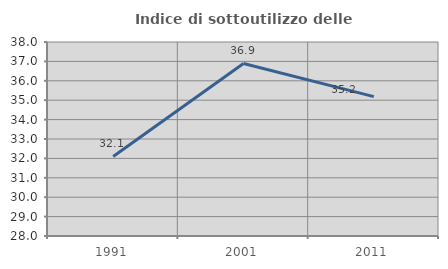
| Category | Indice di sottoutilizzo delle abitazioni  |
|---|---|
| 1991.0 | 32.1 |
| 2001.0 | 36.892 |
| 2011.0 | 35.184 |